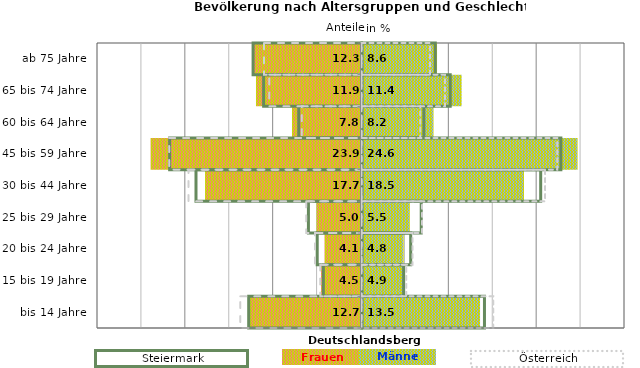
| Category | Frauen | Männer | Frauen Spalte2 | Männer Spalte2 | Frauen Spalte3 | Männer Spalte3 |
|---|---|---|---|---|---|---|
| bis 14 Jahre | -12.7 | 13.5 | 14 | -12.9 | -13.8 | 15 |
| 15 bis 19 Jahre | -4.5 | 4.9 | 4.8 | -4.4 | -4.7 | 5.1 |
| 20 bis 24 Jahre | -4.1 | 4.8 | 5.6 | -5.1 | -5.3 | 5.8 |
| 25 bis 29 Jahre | -5 | 5.5 | 6.8 | -6.1 | -6.3 | 6.9 |
| 30 bis 44 Jahre | -17.7 | 18.5 | 20.4 | -18.9 | -19.7 | 20.9 |
| 45 bis 59 Jahre | -23.9 | 24.6 | 22.7 | -21.9 | -21.9 | 22.3 |
| 60 bis 64 Jahre | -7.8 | 8.2 | 7.1 | -7.2 | -6.8 | 6.7 |
| 65 bis 74 Jahre | -11.9 | 11.4 | 10.1 | -11.2 | -10.5 | 9.5 |
| ab 75 Jahre | -12.3 | 8.6 | 8.4 | -12.4 | -11.1 | 7.8 |